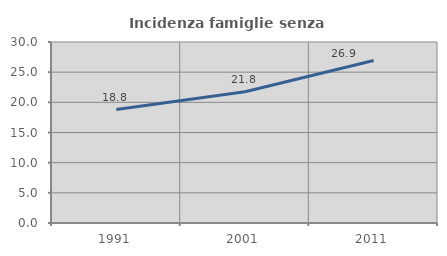
| Category | Incidenza famiglie senza nuclei |
|---|---|
| 1991.0 | 18.8 |
| 2001.0 | 21.767 |
| 2011.0 | 26.921 |